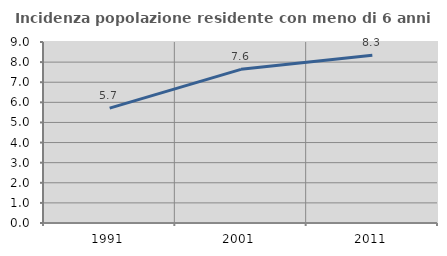
| Category | Incidenza popolazione residente con meno di 6 anni |
|---|---|
| 1991.0 | 5.712 |
| 2001.0 | 7.64 |
| 2011.0 | 8.337 |